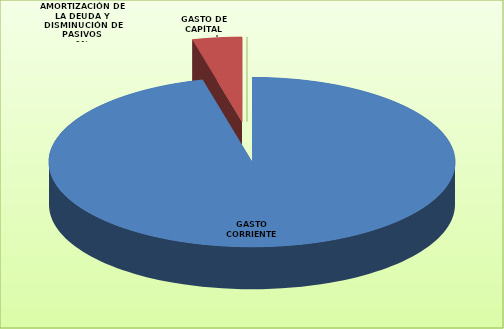
| Category | Series 0 |
|---|---|
| GASTO CORRIENTE | 2810600 |
| GASTO DE CAPÍTAL | 115000 |
| AMORTIZACIÓN DE LA DEUDA Y DISMINUCIÓN DE PASIVOS | 0 |